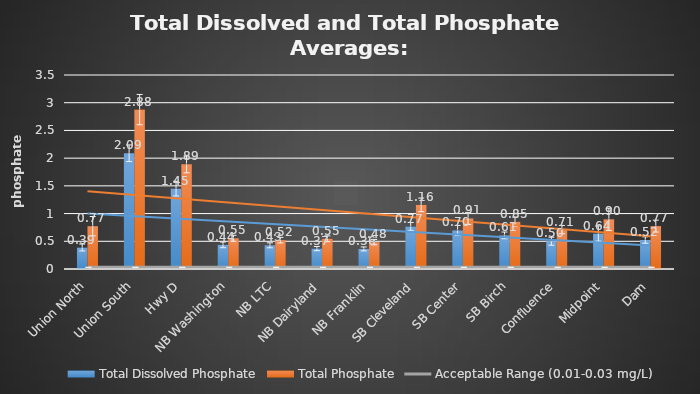
| Category | Total Dissolved Phosphate | Total Phosphate |
|---|---|---|
| Union North | 0.388 | 0.772 |
| Union South | 2.089 | 2.876 |
| Hwy D | 1.45 | 1.888 |
| NB Washington | 0.436 | 0.554 |
| NB LTC | 0.427 | 0.521 |
| NB Dairyland | 0.369 | 0.546 |
| NB Franklin | 0.363 | 0.485 |
| SB Cleveland | 0.766 | 1.157 |
| SB Center | 0.695 | 0.912 |
| SB Birch | 0.607 | 0.851 |
| Confluence | 0.501 | 0.711 |
| Midpoint | 0.64 | 0.896 |
| Dam | 0.523 | 0.774 |